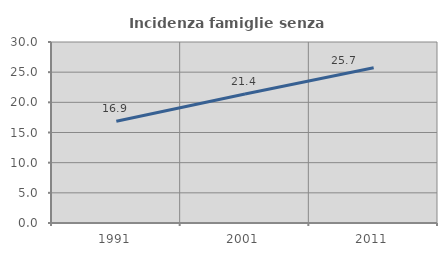
| Category | Incidenza famiglie senza nuclei |
|---|---|
| 1991.0 | 16.852 |
| 2001.0 | 21.391 |
| 2011.0 | 25.719 |